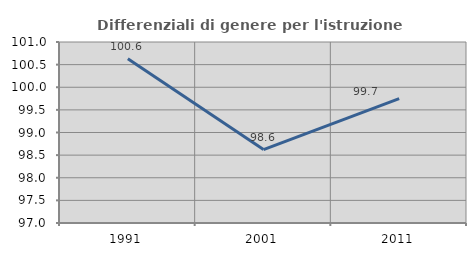
| Category | Differenziali di genere per l'istruzione superiore |
|---|---|
| 1991.0 | 100.632 |
| 2001.0 | 98.622 |
| 2011.0 | 99.749 |